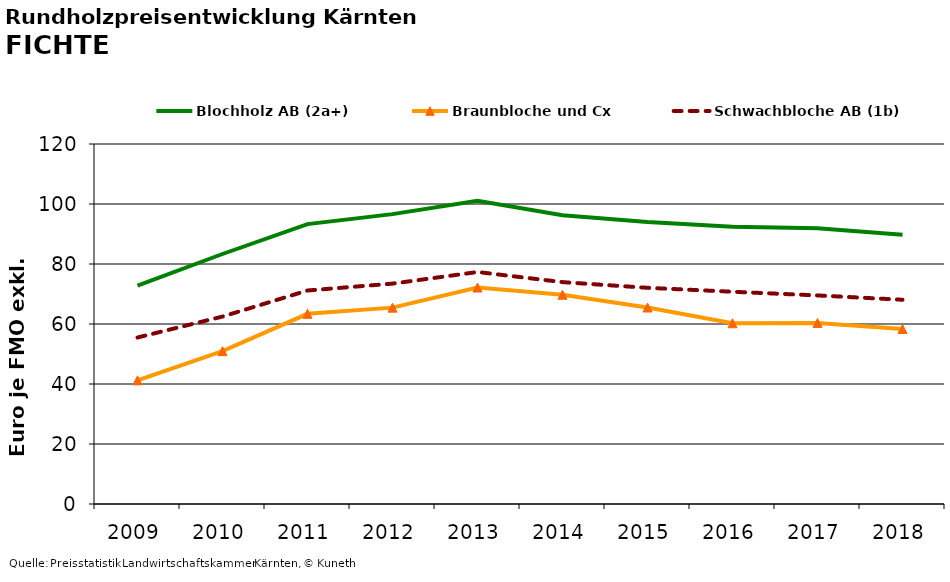
| Category | Blochholz AB (2a+) | Braunbloche und Cx | Schwachbloche AB (1b) |
|---|---|---|---|
| 2009.0 | 72.799 | 41.229 | 55.5 |
| 2010.0 | 83.333 | 50.958 | 62.479 |
| 2011.0 | 93.292 | 63.396 | 71.167 |
| 2012.0 | 96.626 | 65.458 | 73.458 |
| 2013.0 | 101.086 | 72.167 | 77.333 |
| 2014.0 | 96.258 | 69.75 | 73.958 |
| 2015.0 | 94.029 | 65.5 | 72.062 |
| 2016.0 | 92.433 | 60.25 | 70.75 |
| 2017.0 | 91.951 | 60.354 | 69.521 |
| 2018.0 | 89.753 | 58.333 | 68.083 |